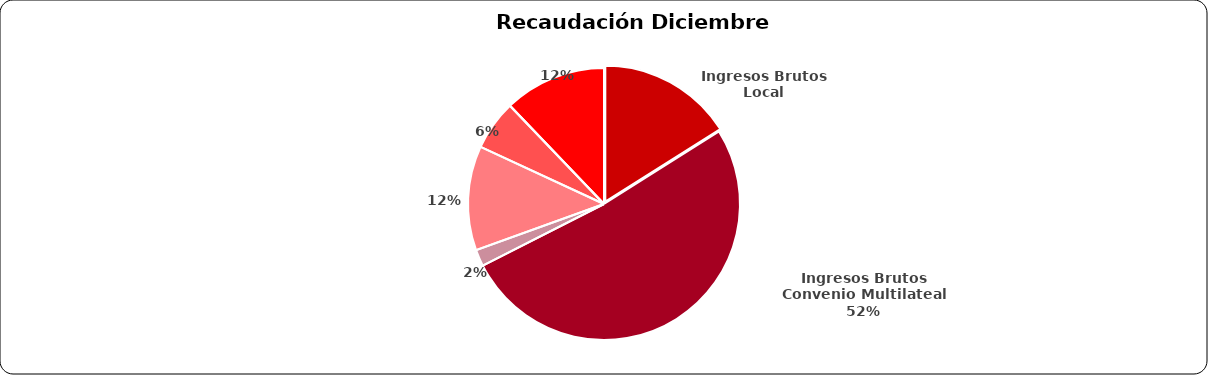
| Category | Recaudación
Diciembre 2022 |
|---|---|
| 0 | 565148553.9 |
| 1 | 1814350741.76 |
| 2 | 69588343.04 |
| 3 | 437460570.33 |
| 4 | 209431759.83 |
| 5 | 902929.55 |
| 6 | 427696863.35 |